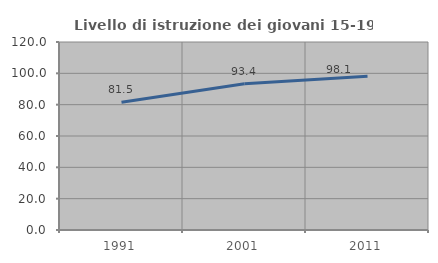
| Category | Livello di istruzione dei giovani 15-19 anni |
|---|---|
| 1991.0 | 81.491 |
| 2001.0 | 93.385 |
| 2011.0 | 98.104 |